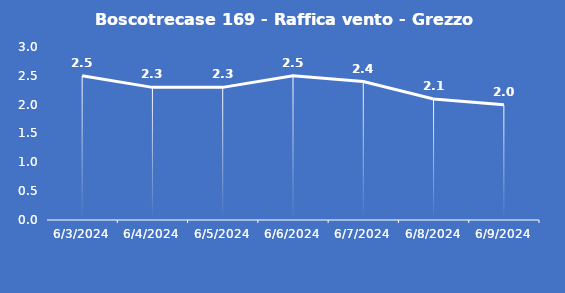
| Category | Boscotrecase 169 - Raffica vento - Grezzo (m/s) |
|---|---|
| 6/3/24 | 2.5 |
| 6/4/24 | 2.3 |
| 6/5/24 | 2.3 |
| 6/6/24 | 2.5 |
| 6/7/24 | 2.4 |
| 6/8/24 | 2.1 |
| 6/9/24 | 2 |